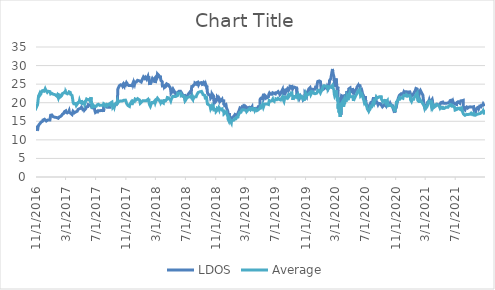
| Category | LDOS | Average |
|---|---|---|
| 11/1/16 | 12.394 | 19.025 |
| 11/2/16 | 12.337 | 19.194 |
| 11/3/16 | 13.289 | 19.428 |
| 11/4/16 | 13.101 | 19.058 |
| 11/7/16 | 13.227 | 19.512 |
| 11/8/16 | 13.026 | 19.651 |
| 11/9/16 | 13.478 | 20.742 |
| 11/10/16 | 13.724 | 20.989 |
| 11/11/16 | 13.906 | 21.803 |
| 11/14/16 | 14.191 | 22.252 |
| 11/15/16 | 14.346 | 21.87 |
| 11/16/16 | 14.331 | 21.999 |
| 11/17/16 | 14.236 | 22.033 |
| 11/18/16 | 14.478 | 22.127 |
| 11/21/16 | 14.804 | 22.443 |
| 11/22/16 | 14.81 | 22.986 |
| 11/23/16 | 14.879 | 23.064 |
| 11/25/16 | 14.963 | 23.169 |
| 11/28/16 | 15.044 | 23.191 |
| 11/29/16 | 15.346 | 23.568 |
| 11/30/16 | 15.328 | 23.244 |
| 12/1/16 | 15.328 | 22.798 |
| 12/2/16 | 15.439 | 23.075 |
| 12/5/16 | 15.532 | 23.196 |
| 12/6/16 | 15.682 | 23.416 |
| 12/7/16 | 15.604 | 23.279 |
| 12/8/16 | 15.648 | 23.744 |
| 12/9/16 | 15.643 | 23.974 |
| 12/12/16 | 15.059 | 23.177 |
| 12/13/16 | 15.274 | 23.156 |
| 12/14/16 | 15.268 | 22.96 |
| 12/15/16 | 15.319 | 22.945 |
| 12/16/16 | 15.319 | 22.806 |
| 12/19/16 | 15.37 | 23.082 |
| 12/20/16 | 15.406 | 23.137 |
| 12/21/16 | 15.376 | 22.961 |
| 12/22/16 | 15.292 | 22.867 |
| 12/23/16 | 15.286 | 22.914 |
| 12/27/16 | 15.343 | 22.979 |
| 12/28/16 | 15.238 | 22.743 |
| 12/29/16 | 15.385 | 22.983 |
| 12/30/16 | 16.633 | 22.368 |
| 1/3/17 | 16.571 | 22.227 |
| 1/4/17 | 16.701 | 22.517 |
| 1/5/17 | 16.513 | 22.375 |
| 1/6/17 | 16.477 | 22.489 |
| 1/9/17 | 16.256 | 22.311 |
| 1/10/17 | 16.35 | 22.446 |
| 1/11/17 | 16.295 | 22.407 |
| 1/12/17 | 16.259 | 22.425 |
| 1/13/17 | 16.249 | 22.386 |
| 1/17/17 | 16.074 | 22.144 |
| 1/18/17 | 16.204 | 22.199 |
| 1/19/17 | 16.161 | 22.048 |
| 1/20/17 | 16.152 | 22.063 |
| 1/23/17 | 16.028 | 21.829 |
| 1/24/17 | 16.09 | 22.021 |
| 1/25/17 | 16.148 | 22.009 |
| 1/26/17 | 16.113 | 22.122 |
| 1/27/17 | 16.116 | 22.182 |
| 1/30/17 | 15.813 | 21.356 |
| 1/31/17 | 15.716 | 21.492 |
| 2/1/17 | 15.712 | 21.424 |
| 2/2/17 | 15.966 | 22.143 |
| 2/3/17 | 16.161 | 22.001 |
| 2/6/17 | 16.301 | 21.948 |
| 2/7/17 | 16.415 | 21.983 |
| 2/8/17 | 16.292 | 21.62 |
| 2/9/17 | 16.529 | 21.79 |
| 2/10/17 | 16.535 | 21.793 |
| 2/13/17 | 16.584 | 21.916 |
| 2/14/17 | 16.607 | 21.845 |
| 2/15/17 | 16.789 | 22.162 |
| 2/16/17 | 16.916 | 22.459 |
| 2/17/17 | 16.896 | 22.347 |
| 2/21/17 | 17.127 | 22.613 |
| 2/22/17 | 17.28 | 22.72 |
| 2/23/17 | 17.072 | 22.459 |
| 2/24/17 | 17.589 | 22.764 |
| 2/27/17 | 17.576 | 22.977 |
| 2/28/17 | 17.336 | 22.429 |
| 3/1/17 | 17.788 | 22.891 |
| 3/2/17 | 17.414 | 22.718 |
| 3/3/17 | 17.462 | 22.589 |
| 3/6/17 | 17.293 | 22.406 |
| 3/7/17 | 17.244 | 22.43 |
| 3/8/17 | 17.144 | 22.387 |
| 3/9/17 | 17.215 | 22.307 |
| 3/10/17 | 17.176 | 22.403 |
| 3/13/17 | 17.547 | 22.637 |
| 3/14/17 | 17.459 | 22.62 |
| 3/15/17 | 17.846 | 22.913 |
| 3/16/17 | 17.479 | 22.662 |
| 3/17/17 | 17.547 | 22.954 |
| 3/20/17 | 17.524 | 22.752 |
| 3/21/17 | 17.17 | 22.27 |
| 3/22/17 | 17.196 | 22.395 |
| 3/23/17 | 17.134 | 22.461 |
| 3/24/17 | 17.114 | 22.234 |
| 3/27/17 | 16.822 | 21.949 |
| 3/28/17 | 16.815 | 21.973 |
| 3/29/17 | 16.988 | 22.061 |
| 3/30/17 | 16.692 | 20.786 |
| 3/31/17 | 17.672 | 20.131 |
| 4/3/17 | 17.468 | 19.737 |
| 4/4/17 | 17.523 | 19.796 |
| 4/5/17 | 17.261 | 19.589 |
| 4/6/17 | 17.295 | 19.661 |
| 4/7/17 | 17.496 | 19.778 |
| 4/10/17 | 17.492 | 19.795 |
| 4/11/17 | 17.624 | 19.925 |
| 4/12/17 | 17.537 | 19.566 |
| 4/13/17 | 17.499 | 19.253 |
| 4/17/17 | 17.72 | 19.622 |
| 4/18/17 | 17.748 | 19.648 |
| 4/19/17 | 17.879 | 19.784 |
| 4/20/17 | 18.176 | 20.033 |
| 4/21/17 | 18.042 | 19.909 |
| 4/24/17 | 18.29 | 20.296 |
| 4/25/17 | 18.366 | 20.29 |
| 4/26/17 | 18.453 | 20.567 |
| 4/27/17 | 18.436 | 20.43 |
| 4/28/17 | 18.197 | 20.131 |
| 5/1/17 | 18.484 | 20.193 |
| 5/2/17 | 18.508 | 20.095 |
| 5/3/17 | 18.522 | 19.929 |
| 5/4/17 | 18.795 | 20.723 |
| 5/5/17 | 18.823 | 20.136 |
| 5/8/17 | 18.422 | 20.029 |
| 5/9/17 | 18.159 | 19.832 |
| 5/10/17 | 18.118 | 19.934 |
| 5/11/17 | 18.211 | 19.794 |
| 5/12/17 | 18.201 | 19.866 |
| 5/15/17 | 18.246 | 20.14 |
| 5/16/17 | 18.56 | 20.17 |
| 5/17/17 | 18.062 | 19.609 |
| 5/18/17 | 17.807 | 19.572 |
| 5/19/17 | 18.007 | 19.671 |
| 5/22/17 | 18.443 | 20.441 |
| 5/23/17 | 18.892 | 20.485 |
| 5/24/17 | 18.971 | 20.619 |
| 5/25/17 | 19.051 | 20.987 |
| 5/26/17 | 18.964 | 21.078 |
| 5/30/17 | 18.954 | 20.803 |
| 5/31/17 | 19.199 | 20.802 |
| 6/1/17 | 19.479 | 21.06 |
| 6/2/17 | 19.334 | 21.001 |
| 6/5/17 | 19.31 | 20.877 |
| 6/6/17 | 19.327 | 20.64 |
| 6/7/17 | 19.237 | 20.59 |
| 6/8/17 | 19.258 | 20.852 |
| 6/9/17 | 19.134 | 20.751 |
| 6/12/17 | 19.22 | 21.473 |
| 6/13/17 | 19.244 | 20.841 |
| 6/14/17 | 19.054 | 20.847 |
| 6/15/17 | 19.065 | 20.734 |
| 6/16/17 | 18.653 | 18.802 |
| 6/19/17 | 18.636 | 18.912 |
| 6/20/17 | 18.446 | 18.825 |
| 6/21/17 | 18.574 | 18.899 |
| 6/22/17 | 18.526 | 19.261 |
| 6/23/17 | 18.508 | 19.005 |
| 6/26/17 | 18.56 | 18.95 |
| 6/27/17 | 18.021 | 18.761 |
| 6/28/17 | 18.066 | 19.147 |
| 6/29/17 | 17.783 | 18.872 |
| 6/30/17 | 17.366 | 18.913 |
| 7/3/17 | 17.474 | 19.037 |
| 7/5/17 | 17.591 | 19.159 |
| 7/6/17 | 17.198 | 18.968 |
| 7/7/17 | 17.494 | 19.425 |
| 7/10/17 | 17.494 | 19.208 |
| 7/11/17 | 17.544 | 19.392 |
| 7/12/17 | 17.836 | 19.578 |
| 7/13/17 | 17.675 | 19.49 |
| 7/14/17 | 17.887 | 19.551 |
| 7/17/17 | 17.833 | 19.286 |
| 7/18/17 | 17.668 | 19.137 |
| 7/19/17 | 17.937 | 19.442 |
| 7/20/17 | 18.015 | 19.391 |
| 7/21/17 | 17.954 | 19.291 |
| 7/24/17 | 17.924 | 19.304 |
| 7/25/17 | 18.105 | 19.488 |
| 7/26/17 | 17.968 | 19.49 |
| 7/27/17 | 17.941 | 19.434 |
| 7/28/17 | 18.008 | 19.507 |
| 7/31/17 | 17.954 | 19.343 |
| 8/1/17 | 17.914 | 19.653 |
| 8/2/17 | 17.561 | 19.337 |
| 8/3/17 | 19.029 | 19.717 |
| 8/4/17 | 18.878 | 19.783 |
| 8/7/17 | 18.932 | 19.584 |
| 8/8/17 | 19.036 | 19.506 |
| 8/9/17 | 18.875 | 19.188 |
| 8/10/17 | 18.972 | 19.204 |
| 8/11/17 | 19.043 | 19.305 |
| 8/14/17 | 19.274 | 19.488 |
| 8/15/17 | 19.251 | 19.462 |
| 8/16/17 | 19.221 | 19.683 |
| 8/17/17 | 18.794 | 19.216 |
| 8/18/17 | 18.592 | 19.09 |
| 8/21/17 | 18.582 | 19.229 |
| 8/22/17 | 18.784 | 19.59 |
| 8/23/17 | 18.888 | 19.509 |
| 8/24/17 | 18.663 | 19.48 |
| 8/25/17 | 18.767 | 19.451 |
| 8/28/17 | 18.781 | 19.392 |
| 8/29/17 | 19.022 | 19.541 |
| 8/30/17 | 19.264 | 19.637 |
| 8/31/17 | 19.594 | 19.957 |
| 9/1/17 | 19.735 | 20.206 |
| 9/5/17 | 19.419 | 20.163 |
| 9/6/17 | 19.473 | 20.233 |
| 9/7/17 | 19.385 | 20.126 |
| 9/8/17 | 19.187 | 18.761 |
| 9/11/17 | 19.288 | 18.955 |
| 9/12/17 | 19.379 | 19.152 |
| 9/13/17 | 19.197 | 19.059 |
| 9/14/17 | 18.925 | 18.83 |
| 9/15/17 | 18.948 | 19.193 |
| 9/18/17 | 19.261 | 19.394 |
| 9/19/17 | 19.493 | 19.739 |
| 9/20/17 | 19.543 | 19.906 |
| 9/21/17 | 19.577 | 19.904 |
| 9/22/17 | 19.765 | 19.969 |
| 9/25/17 | 19.681 | 20.012 |
| 9/26/17 | 19.731 | 20.17 |
| 9/27/17 | 19.966 | 20.473 |
| 9/28/17 | 19.792 | 20.374 |
| 9/29/17 | 23.644 | 19.975 |
| 10/2/17 | 24.119 | 20.266 |
| 10/3/17 | 23.924 | 20.306 |
| 10/4/17 | 24.055 | 20.328 |
| 10/5/17 | 24.566 | 20.473 |
| 10/6/17 | 24.654 | 20.407 |
| 10/9/17 | 24.754 | 20.474 |
| 10/10/17 | 24.814 | 20.567 |
| 10/11/17 | 24.81 | 20.43 |
| 10/12/17 | 24.882 | 20.51 |
| 10/13/17 | 25.057 | 20.591 |
| 10/16/17 | 24.786 | 20.445 |
| 10/17/17 | 24.682 | 20.216 |
| 10/18/17 | 24.514 | 20.323 |
| 10/19/17 | 24.562 | 20.434 |
| 10/20/17 | 24.826 | 20.638 |
| 10/23/17 | 24.666 | 20.65 |
| 10/24/17 | 24.45 | 20.729 |
| 10/25/17 | 25.049 | 20.834 |
| 10/26/17 | 24.942 | 20.851 |
| 10/27/17 | 24.898 | 20.896 |
| 10/30/17 | 24.73 | 20.695 |
| 10/31/17 | 24.962 | 20.869 |
| 11/1/17 | 25.085 | 20.742 |
| 11/2/17 | 25.081 | 20.209 |
| 11/3/17 | 25.417 | 19.93 |
| 11/6/17 | 25.133 | 19.53 |
| 11/7/17 | 24.986 | 19.653 |
| 11/8/17 | 24.842 | 19.552 |
| 11/9/17 | 24.614 | 19.286 |
| 11/10/17 | 24.702 | 19.2 |
| 11/13/17 | 24.606 | 19.107 |
| 11/14/17 | 24.506 | 19.085 |
| 11/15/17 | 24.67 | 19.011 |
| 11/16/17 | 24.69 | 19.419 |
| 11/17/17 | 24.391 | 19.332 |
| 11/20/17 | 24.61 | 19.548 |
| 11/21/17 | 24.534 | 20.009 |
| 11/22/17 | 24.395 | 19.726 |
| 11/24/17 | 24.478 | 19.708 |
| 11/27/17 | 24.578 | 19.722 |
| 11/28/17 | 25.069 | 20.014 |
| 11/29/17 | 24.91 | 20.152 |
| 11/30/17 | 25.381 | 20.454 |
| 12/1/17 | 24.882 | 20.277 |
| 12/4/17 | 25.337 | 20.313 |
| 12/5/17 | 25.289 | 20.317 |
| 12/6/17 | 24.998 | 20.166 |
| 12/7/17 | 25.225 | 20.447 |
| 12/8/17 | 25.604 | 20.971 |
| 12/11/17 | 25.668 | 20.824 |
| 12/12/17 | 25.608 | 20.761 |
| 12/13/17 | 25.576 | 20.765 |
| 12/14/17 | 25.5 | 20.532 |
| 12/15/17 | 25.792 | 20.816 |
| 12/18/17 | 26.028 | 21.106 |
| 12/19/17 | 25.848 | 21.025 |
| 12/20/17 | 25.964 | 20.975 |
| 12/21/17 | 25.992 | 20.867 |
| 12/22/17 | 26.04 | 20.851 |
| 12/26/17 | 25.868 | 20.733 |
| 12/27/17 | 25.808 | 20.719 |
| 12/28/17 | 25.88 | 20.704 |
| 12/29/17 | 25.808 | 19.874 |
| 1/2/18 | 25.58 | 20.021 |
| 1/3/18 | 25.548 | 20.197 |
| 1/4/18 | 25.9 | 20.189 |
| 1/5/18 | 25.872 | 20.273 |
| 1/8/18 | 26.531 | 20.545 |
| 1/9/18 | 26.476 | 20.455 |
| 1/10/18 | 26.611 | 20.438 |
| 1/11/18 | 26.955 | 20.695 |
| 1/12/18 | 26.791 | 20.466 |
| 1/16/18 | 26.555 | 20.514 |
| 1/17/18 | 26.747 | 20.656 |
| 1/18/18 | 26.511 | 20.403 |
| 1/19/18 | 26.835 | 20.563 |
| 1/22/18 | 26.831 | 20.514 |
| 1/23/18 | 26.755 | 20.604 |
| 1/24/18 | 26.316 | 20.403 |
| 1/25/18 | 26.348 | 20.538 |
| 1/26/18 | 26.495 | 20.772 |
| 1/29/18 | 27.059 | 20.878 |
| 1/30/18 | 26.651 | 20.526 |
| 1/31/18 | 26.619 | 20.452 |
| 2/1/18 | 27.159 | 21.052 |
| 2/2/18 | 26.472 | 20.219 |
| 2/5/18 | 25.232 | 19.424 |
| 2/6/18 | 24.769 | 19.17 |
| 2/7/18 | 25.7 | 19.499 |
| 2/8/18 | 25.005 | 19.022 |
| 2/9/18 | 25.029 | 19.178 |
| 2/12/18 | 25.716 | 19.771 |
| 2/13/18 | 25.828 | 19.722 |
| 2/14/18 | 26.272 | 20.051 |
| 2/15/18 | 26.412 | 20.133 |
| 2/16/18 | 26.547 | 20.052 |
| 2/20/18 | 26.472 | 20.003 |
| 2/21/18 | 26.064 | 20.041 |
| 2/22/18 | 26.28 | 20.15 |
| 2/23/18 | 26.312 | 20.264 |
| 2/26/18 | 26.539 | 20.493 |
| 2/27/18 | 26.068 | 20.398 |
| 2/28/18 | 25.304 | 19.997 |
| 3/1/18 | 25.484 | 20.038 |
| 3/2/18 | 25.98 | 20.391 |
| 3/5/18 | 26.352 | 20.687 |
| 3/6/18 | 26.46 | 20.757 |
| 3/7/18 | 26.635 | 20.733 |
| 3/8/18 | 27.143 | 20.79 |
| 3/9/18 | 27.746 | 21.211 |
| 3/12/18 | 27.714 | 20.977 |
| 3/13/18 | 27.698 | 20.878 |
| 3/14/18 | 27.391 | 20.887 |
| 3/15/18 | 27.187 | 20.88 |
| 3/16/18 | 27.063 | 21.121 |
| 3/19/18 | 26.839 | 20.368 |
| 3/20/18 | 27.011 | 20.767 |
| 3/21/18 | 26.999 | 20.744 |
| 3/22/18 | 26.372 | 20.314 |
| 3/23/18 | 25.988 | 19.969 |
| 3/26/18 | 26.232 | 20.248 |
| 3/27/18 | 25.78 | 20.147 |
| 3/28/18 | 25.684 | 20.092 |
| 3/29/18 | 24.48 | 20.049 |
| 4/2/18 | 24.285 | 19.918 |
| 4/3/18 | 24.461 | 20.407 |
| 4/4/18 | 24.618 | 20.588 |
| 4/5/18 | 24.884 | 20.907 |
| 4/6/18 | 24.278 | 20.353 |
| 4/9/18 | 24.248 | 20.308 |
| 4/10/18 | 24.641 | 20.53 |
| 4/11/18 | 24.352 | 20.488 |
| 4/12/18 | 24.588 | 20.66 |
| 4/13/18 | 24.416 | 20.641 |
| 4/16/18 | 24.674 | 20.926 |
| 4/17/18 | 25.015 | 21.152 |
| 4/18/18 | 25.15 | 21.403 |
| 4/19/18 | 24.996 | 21.339 |
| 4/20/18 | 24.753 | 21.269 |
| 4/23/18 | 24.794 | 21.306 |
| 4/24/18 | 24.558 | 21.153 |
| 4/25/18 | 24.524 | 21.031 |
| 4/26/18 | 24.558 | 21.11 |
| 4/27/18 | 24.622 | 20.995 |
| 4/30/18 | 24.042 | 20.808 |
| 5/1/18 | 23.761 | 20.74 |
| 5/2/18 | 23.222 | 20.501 |
| 5/3/18 | 22.559 | 20.756 |
| 5/4/18 | 22.507 | 20.95 |
| 5/7/18 | 22.769 | 21.158 |
| 5/8/18 | 23.031 | 21.414 |
| 5/9/18 | 23.405 | 21.583 |
| 5/10/18 | 23.611 | 21.715 |
| 5/11/18 | 23.682 | 21.806 |
| 5/14/18 | 23.319 | 21.668 |
| 5/15/18 | 23.031 | 21.708 |
| 5/16/18 | 23.012 | 21.911 |
| 5/17/18 | 22.743 | 21.577 |
| 5/18/18 | 22.949 | 21.647 |
| 5/21/18 | 22.982 | 21.654 |
| 5/22/18 | 22.387 | 21.418 |
| 5/23/18 | 22.683 | 21.457 |
| 5/24/18 | 22.586 | 21.551 |
| 5/25/18 | 22.556 | 21.49 |
| 5/29/18 | 22.38 | 21.919 |
| 5/30/18 | 22.679 | 22.502 |
| 5/31/18 | 22.481 | 22.539 |
| 6/1/18 | 22.773 | 22.412 |
| 6/4/18 | 23.054 | 22.532 |
| 6/5/18 | 23.173 | 22.576 |
| 6/6/18 | 23.184 | 22.589 |
| 6/7/18 | 22.848 | 22.414 |
| 6/8/18 | 22.941 | 22.547 |
| 6/11/18 | 23.054 | 22.577 |
| 6/12/18 | 23.162 | 22.549 |
| 6/13/18 | 23.117 | 21.862 |
| 6/14/18 | 22.739 | 21.951 |
| 6/15/18 | 22.526 | 21.855 |
| 6/18/18 | 22.271 | 21.986 |
| 6/19/18 | 22.271 | 22.039 |
| 6/20/18 | 21.841 | 21.888 |
| 6/21/18 | 21.68 | 22.223 |
| 6/22/18 | 21.897 | 22.118 |
| 6/25/18 | 22.028 | 21.803 |
| 6/26/18 | 22.327 | 21.881 |
| 6/27/18 | 21.916 | 21.791 |
| 6/28/18 | 21.953 | 21.768 |
| 6/29/18 | 21.055 | 20.484 |
| 7/2/18 | 21.191 | 20.755 |
| 7/3/18 | 21.134 | 20.979 |
| 7/5/18 | 21.277 | 21.008 |
| 7/6/18 | 21.476 | 21.372 |
| 7/9/18 | 21.89 | 21.475 |
| 7/10/18 | 21.865 | 21.385 |
| 7/11/18 | 21.926 | 21.459 |
| 7/12/18 | 22.29 | 21.669 |
| 7/13/18 | 22.279 | 21.684 |
| 7/16/18 | 22.301 | 21.603 |
| 7/17/18 | 22.69 | 21.768 |
| 7/18/18 | 22.665 | 21.735 |
| 7/19/18 | 22.858 | 21.787 |
| 7/20/18 | 22.961 | 21.821 |
| 7/23/18 | 23.029 | 21.701 |
| 7/24/18 | 22.561 | 21.428 |
| 7/25/18 | 22.75 | 21.509 |
| 7/26/18 | 24.342 | 21.623 |
| 7/27/18 | 24.435 | 21.38 |
| 7/30/18 | 24.114 | 20.877 |
| 7/31/18 | 24.417 | 21.587 |
| 8/1/18 | 24.488 | 21.522 |
| 8/2/18 | 24.695 | 21.728 |
| 8/3/18 | 24.835 | 21.217 |
| 8/6/18 | 24.867 | 21.565 |
| 8/7/18 | 24.902 | 21.533 |
| 8/8/18 | 25.313 | 21.776 |
| 8/9/18 | 25.209 | 21.761 |
| 8/10/18 | 25.177 | 21.623 |
| 8/13/18 | 25.081 | 21.585 |
| 8/14/18 | 25.359 | 21.8 |
| 8/15/18 | 25.202 | 21.687 |
| 8/16/18 | 25.266 | 22.151 |
| 8/17/18 | 25.595 | 22.233 |
| 8/20/18 | 25.523 | 22.292 |
| 8/21/18 | 25.691 | 22.732 |
| 8/22/18 | 25.463 | 22.749 |
| 8/23/18 | 24.813 | 22.469 |
| 8/24/18 | 25.052 | 22.704 |
| 8/27/18 | 25.298 | 22.928 |
| 8/28/18 | 25.124 | 22.868 |
| 8/29/18 | 25.384 | 23.084 |
| 8/30/18 | 25.341 | 22.911 |
| 8/31/18 | 25.256 | 22.862 |
| 9/4/18 | 25.42 | 23.042 |
| 9/5/18 | 25.241 | 23.167 |
| 9/6/18 | 25.32 | 23.113 |
| 9/7/18 | 24.92 | 23.023 |
| 9/10/18 | 24.981 | 22.193 |
| 9/11/18 | 25.056 | 22.124 |
| 9/12/18 | 25.056 | 21.993 |
| 9/13/18 | 25.295 | 22.046 |
| 9/14/18 | 25.398 | 22.227 |
| 9/17/18 | 25.188 | 21.962 |
| 9/18/18 | 25.066 | 21.883 |
| 9/19/18 | 24.424 | 21.326 |
| 9/20/18 | 24.535 | 21.225 |
| 9/21/18 | 24.895 | 21.406 |
| 9/24/18 | 24.267 | 21.441 |
| 9/25/18 | 24.567 | 21.477 |
| 9/26/18 | 24.246 | 21.385 |
| 9/27/18 | 24.421 | 21.359 |
| 9/28/18 | 22.677 | 19.665 |
| 10/1/18 | 22.251 | 19.455 |
| 10/2/18 | 22.471 | 19.462 |
| 10/3/18 | 22.205 | 19.442 |
| 10/4/18 | 22.198 | 19.284 |
| 10/5/18 | 22.136 | 19.334 |
| 10/8/18 | 22.031 | 19.242 |
| 10/9/18 | 22.035 | 19.276 |
| 10/10/18 | 21.651 | 18.705 |
| 10/11/18 | 21.231 | 18.387 |
| 10/12/18 | 21.339 | 18.387 |
| 10/15/18 | 21.605 | 18.622 |
| 10/16/18 | 22.176 | 19.098 |
| 10/17/18 | 22.198 | 18.956 |
| 10/18/18 | 21.874 | 18.653 |
| 10/19/18 | 22.156 | 18.704 |
| 10/22/18 | 22.015 | 18.94 |
| 10/23/18 | 21.792 | 18.849 |
| 10/24/18 | 20.53 | 18.039 |
| 10/25/18 | 20.074 | 18.156 |
| 10/26/18 | 20.077 | 17.929 |
| 10/29/18 | 20.274 | 18.04 |
| 10/30/18 | 20.697 | 18.067 |
| 10/31/18 | 21.241 | 18.568 |
| 11/1/18 | 20.776 | 18.222 |
| 11/2/18 | 20.461 | 17.644 |
| 11/5/18 | 20.516 | 17.682 |
| 11/6/18 | 20.825 | 17.968 |
| 11/7/18 | 21.526 | 18.568 |
| 11/8/18 | 21.585 | 18.553 |
| 11/9/18 | 21.389 | 18.621 |
| 11/12/18 | 21.11 | 18.433 |
| 11/13/18 | 21.136 | 18.529 |
| 11/14/18 | 20.752 | 18.15 |
| 11/15/18 | 21.1 | 18.609 |
| 11/16/18 | 21.212 | 18.678 |
| 11/19/18 | 20.956 | 18.248 |
| 11/20/18 | 20.474 | 18.01 |
| 11/21/18 | 20.67 | 18.182 |
| 11/23/18 | 20.625 | 18.159 |
| 11/26/18 | 20.92 | 18.359 |
| 11/27/18 | 20.576 | 17.973 |
| 11/28/18 | 20.73 | 18.127 |
| 11/29/18 | 20.356 | 17.947 |
| 11/30/18 | 20.657 | 17.88 |
| 12/3/18 | 20.52 | 17.827 |
| 12/4/18 | 19.329 | 17.014 |
| 12/6/18 | 19.759 | 17.099 |
| 12/7/18 | 19.303 | 17.226 |
| 12/10/18 | 19.503 | 17.391 |
| 12/11/18 | 19.208 | 17.38 |
| 12/12/18 | 19.503 | 17.868 |
| 12/13/18 | 19.162 | 17.633 |
| 12/14/18 | 18.706 | 17.3 |
| 12/17/18 | 18.202 | 16.834 |
| 12/18/18 | 18.182 | 16.77 |
| 12/19/18 | 17.867 | 16.472 |
| 12/20/18 | 17.585 | 16.171 |
| 12/21/18 | 16.857 | 15.514 |
| 12/24/18 | 16.572 | 15.098 |
| 12/26/18 | 17.178 | 15.725 |
| 12/27/18 | 17.234 | 15.684 |
| 12/28/18 | 15.504 | 15.78 |
| 12/31/18 | 15.598 | 14.993 |
| 1/2/19 | 15.4 | 14.806 |
| 1/3/19 | 15.187 | 14.591 |
| 1/4/19 | 15.794 | 15.119 |
| 1/7/19 | 15.829 | 15.065 |
| 1/8/19 | 15.95 | 15.33 |
| 1/9/19 | 16.146 | 15.268 |
| 1/10/19 | 16.246 | 15.285 |
| 1/11/19 | 16.397 | 15.476 |
| 1/14/19 | 16.37 | 15.314 |
| 1/15/19 | 16.388 | 15.331 |
| 1/16/19 | 16.356 | 15.442 |
| 1/17/19 | 16.592 | 15.754 |
| 1/18/19 | 16.829 | 15.83 |
| 1/22/19 | 16.604 | 15.707 |
| 1/23/19 | 16.613 | 15.674 |
| 1/24/19 | 16.678 | 15.72 |
| 1/25/19 | 16.879 | 16.109 |
| 1/28/19 | 16.891 | 15.937 |
| 1/29/19 | 17.016 | 16.07 |
| 1/30/19 | 17.217 | 16.156 |
| 1/31/19 | 17.16 | 16.497 |
| 2/1/19 | 17.498 | 16.759 |
| 2/4/19 | 17.965 | 17.111 |
| 2/5/19 | 18.131 | 17.288 |
| 2/6/19 | 18.184 | 17.388 |
| 2/7/19 | 18.557 | 17.537 |
| 2/8/19 | 18.368 | 17.619 |
| 2/11/19 | 18.326 | 17.44 |
| 2/12/19 | 18.35 | 17.588 |
| 2/13/19 | 18.409 | 17.716 |
| 2/14/19 | 18.442 | 17.779 |
| 2/15/19 | 18.749 | 18.051 |
| 2/19/19 | 18.436 | 18.109 |
| 2/20/19 | 18.249 | 18.123 |
| 2/21/19 | 18.625 | 18.033 |
| 2/22/19 | 19.081 | 18.213 |
| 2/25/19 | 19.131 | 18.063 |
| 2/26/19 | 18.802 | 17.805 |
| 2/27/19 | 18.912 | 17.844 |
| 2/28/19 | 19.11 | 17.866 |
| 3/1/19 | 19.226 | 18.084 |
| 3/4/19 | 18.965 | 17.91 |
| 3/5/19 | 18.811 | 17.79 |
| 3/6/19 | 18.649 | 17.592 |
| 3/7/19 | 18.471 | 17.551 |
| 3/8/19 | 18.474 | 17.625 |
| 3/11/19 | 18.693 | 17.999 |
| 3/12/19 | 18.649 | 18.014 |
| 3/13/19 | 18.743 | 18.211 |
| 3/14/19 | 18.563 | 18.266 |
| 3/15/19 | 18.59 | 18.256 |
| 3/18/19 | 18.785 | 18.394 |
| 3/19/19 | 18.729 | 18.338 |
| 3/20/19 | 18.717 | 18.166 |
| 3/21/19 | 18.862 | 18.431 |
| 3/22/19 | 18.637 | 18.082 |
| 3/25/19 | 18.53 | 18.076 |
| 3/26/19 | 18.749 | 18.445 |
| 3/27/19 | 18.72 | 18.321 |
| 3/28/19 | 18.856 | 18.44 |
| 3/29/19 | 18.25 | 18.22 |
| 4/1/19 | 18.478 | 18.435 |
| 4/2/19 | 18.122 | 18.124 |
| 4/3/19 | 18.134 | 18.083 |
| 4/4/19 | 18.219 | 18.08 |
| 4/5/19 | 18.396 | 18.274 |
| 4/8/19 | 18.452 | 18.214 |
| 4/9/19 | 18.225 | 17.919 |
| 4/10/19 | 18.401 | 18.044 |
| 4/11/19 | 18.581 | 18.164 |
| 4/12/19 | 18.606 | 18.233 |
| 4/15/19 | 18.498 | 18.215 |
| 4/16/19 | 18.546 | 18.073 |
| 4/17/19 | 18.538 | 17.871 |
| 4/18/19 | 18.581 | 17.921 |
| 4/22/19 | 18.623 | 18.068 |
| 4/23/19 | 18.939 | 18.32 |
| 4/24/19 | 18.945 | 18.306 |
| 4/25/19 | 18.905 | 18.232 |
| 4/26/19 | 18.951 | 18.341 |
| 4/29/19 | 19.042 | 18.284 |
| 4/30/19 | 20.924 | 18.613 |
| 5/1/19 | 20.745 | 18.264 |
| 5/2/19 | 20.827 | 18.744 |
| 5/3/19 | 21.2 | 19.117 |
| 5/6/19 | 21.104 | 19.293 |
| 5/7/19 | 20.938 | 18.928 |
| 5/8/19 | 21.121 | 18.957 |
| 5/9/19 | 21.363 | 19.161 |
| 5/10/19 | 21.494 | 19.381 |
| 5/13/19 | 21.007 | 18.753 |
| 5/14/19 | 21.158 | 18.864 |
| 5/15/19 | 21.371 | 19.109 |
| 5/16/19 | 21.724 | 19.546 |
| 5/17/19 | 21.639 | 19.483 |
| 5/20/19 | 21.434 | 19.477 |
| 5/21/19 | 21.85 | 19.661 |
| 5/22/19 | 21.918 | 19.764 |
| 5/23/19 | 21.679 | 19.534 |
| 5/24/19 | 21.719 | 19.708 |
| 5/28/19 | 21.351 | 19.678 |
| 5/29/19 | 21.3 | 19.613 |
| 5/30/19 | 21.309 | 19.572 |
| 5/31/19 | 21.451 | 19.607 |
| 6/3/19 | 21.619 | 19.527 |
| 6/4/19 | 22.211 | 19.856 |
| 6/5/19 | 22.246 | 20.044 |
| 6/6/19 | 22.411 | 20.6 |
| 6/7/19 | 22.616 | 20.781 |
| 6/10/19 | 22.544 | 20.75 |
| 6/11/19 | 22.305 | 20.4 |
| 6/12/19 | 22.567 | 20.538 |
| 6/13/19 | 22.331 | 20.587 |
| 6/14/19 | 22.451 | 20.45 |
| 6/17/19 | 22.282 | 20.555 |
| 6/18/19 | 22.391 | 20.562 |
| 6/19/19 | 22.391 | 20.749 |
| 6/20/19 | 22.684 | 20.93 |
| 6/21/19 | 22.473 | 20.633 |
| 6/24/19 | 22.485 | 20.578 |
| 6/25/19 | 22.533 | 20.618 |
| 6/26/19 | 22.357 | 20.386 |
| 6/27/19 | 22.607 | 20.662 |
| 6/28/19 | 22.271 | 20.553 |
| 7/1/19 | 22.36 | 20.711 |
| 7/2/19 | 22.352 | 20.765 |
| 7/3/19 | 22.703 | 21.049 |
| 7/5/19 | 22.876 | 21.181 |
| 7/8/19 | 22.706 | 20.884 |
| 7/9/19 | 22.737 | 21.055 |
| 7/10/19 | 22.731 | 21.089 |
| 7/11/19 | 22.854 | 20.932 |
| 7/12/19 | 22.99 | 21.193 |
| 7/15/19 | 22.965 | 21.169 |
| 7/16/19 | 22.882 | 21.123 |
| 7/17/19 | 22.527 | 20.874 |
| 7/18/19 | 22.58 | 20.902 |
| 7/19/19 | 22.198 | 20.703 |
| 7/22/19 | 22.196 | 20.738 |
| 7/23/19 | 22.544 | 20.85 |
| 7/24/19 | 22.759 | 21.009 |
| 7/25/19 | 22.633 | 20.966 |
| 7/26/19 | 22.99 | 21.252 |
| 7/29/19 | 23.239 | 21.524 |
| 7/30/19 | 23.534 | 21.279 |
| 7/31/19 | 22.898 | 21.096 |
| 8/1/19 | 23.264 | 21.121 |
| 8/2/19 | 22.831 | 20.903 |
| 8/5/19 | 22.028 | 20.357 |
| 8/6/19 | 22.324 | 20.665 |
| 8/7/19 | 22.472 | 20.901 |
| 8/8/19 | 23.4 | 21.508 |
| 8/9/19 | 23.166 | 21.37 |
| 8/12/19 | 23.163 | 21.349 |
| 8/13/19 | 23.504 | 21.405 |
| 8/14/19 | 23.099 | 20.913 |
| 8/15/19 | 23.124 | 20.859 |
| 8/16/19 | 23.378 | 21.357 |
| 8/19/19 | 23.73 | 21.534 |
| 8/20/19 | 23.559 | 21.534 |
| 8/21/19 | 23.858 | 21.942 |
| 8/22/19 | 23.863 | 21.933 |
| 8/23/19 | 23.264 | 21.494 |
| 8/26/19 | 23.512 | 21.703 |
| 8/27/19 | 23.716 | 21.688 |
| 8/28/19 | 23.908 | 21.941 |
| 8/29/19 | 24.321 | 22.275 |
| 8/30/19 | 24.365 | 22.442 |
| 9/3/19 | 24.084 | 22.412 |
| 9/4/19 | 24.438 | 22.674 |
| 9/5/19 | 24.773 | 22.962 |
| 9/6/19 | 24.438 | 22.349 |
| 9/9/19 | 23.685 | 21.74 |
| 9/10/19 | 23.426 | 20.759 |
| 9/11/19 | 23.774 | 21.06 |
| 9/12/19 | 24.084 | 21.314 |
| 9/13/19 | 23.936 | 21.251 |
| 9/16/19 | 24.07 | 21.315 |
| 9/17/19 | 24.181 | 21.666 |
| 9/18/19 | 24.432 | 21.868 |
| 9/19/19 | 24.368 | 21.835 |
| 9/20/19 | 24.078 | 21.71 |
| 9/23/19 | 23.9 | 21.612 |
| 9/24/19 | 23.989 | 21.65 |
| 9/25/19 | 24.276 | 22.041 |
| 9/26/19 | 24.301 | 22.332 |
| 9/27/19 | 22.311 | 21.864 |
| 9/30/19 | 22.536 | 22.136 |
| 10/1/19 | 22.248 | 21.704 |
| 10/2/19 | 21.77 | 21.412 |
| 10/3/19 | 21.781 | 21.529 |
| 10/4/19 | 21.946 | 21.813 |
| 10/7/19 | 21.99 | 21.768 |
| 10/8/19 | 21.476 | 21.473 |
| 10/9/19 | 21.702 | 21.702 |
| 10/10/19 | 21.794 | 21.852 |
| 10/11/19 | 21.823 | 21.932 |
| 10/14/19 | 21.639 | 21.671 |
| 10/15/19 | 21.578 | 21.797 |
| 10/16/19 | 21.345 | 21.678 |
| 10/17/19 | 21.442 | 21.633 |
| 10/18/19 | 21.418 | 21.374 |
| 10/21/19 | 21.214 | 21.399 |
| 10/22/19 | 20.807 | 20.777 |
| 10/23/19 | 20.794 | 20.6 |
| 10/24/19 | 21.004 | 20.768 |
| 10/25/19 | 20.988 | 20.779 |
| 10/28/19 | 21.206 | 20.88 |
| 10/29/19 | 22.67 | 21.356 |
| 10/30/19 | 22.749 | 21.549 |
| 10/31/19 | 22.628 | 21.463 |
| 11/1/19 | 22.392 | 22.426 |
| 11/4/19 | 22.51 | 22.206 |
| 11/5/19 | 21.828 | 21.807 |
| 11/6/19 | 22.34 | 22.045 |
| 11/7/19 | 22.568 | 22.113 |
| 11/8/19 | 22.883 | 22.106 |
| 11/11/19 | 23.006 | 22.244 |
| 11/12/19 | 23.358 | 22.266 |
| 11/13/19 | 23.484 | 22.166 |
| 11/14/19 | 23.733 | 22.442 |
| 11/15/19 | 23.888 | 22.539 |
| 11/18/19 | 23.982 | 22.732 |
| 11/19/19 | 24.066 | 22.732 |
| 11/20/19 | 24.053 | 22.816 |
| 11/21/19 | 23.631 | 22.6 |
| 11/22/19 | 23.224 | 22.249 |
| 11/25/19 | 23.625 | 22.67 |
| 11/26/19 | 23.804 | 22.99 |
| 11/27/19 | 23.875 | 23.083 |
| 11/29/19 | 23.838 | 22.901 |
| 12/2/19 | 23.578 | 22.844 |
| 12/3/19 | 23.528 | 22.549 |
| 12/4/19 | 23.549 | 22.674 |
| 12/5/19 | 23.604 | 22.633 |
| 12/6/19 | 23.796 | 22.711 |
| 12/9/19 | 23.644 | 22.429 |
| 12/10/19 | 23.523 | 22.384 |
| 12/11/19 | 24.163 | 22.384 |
| 12/12/19 | 23.93 | 22.392 |
| 12/13/19 | 24.1 | 22.605 |
| 12/16/19 | 24.048 | 22.578 |
| 12/17/19 | 24.019 | 22.576 |
| 12/18/19 | 25.108 | 22.684 |
| 12/19/19 | 25.266 | 22.993 |
| 12/20/19 | 25.719 | 23.353 |
| 12/23/19 | 25.67 | 23.468 |
| 12/24/19 | 25.725 | 23.324 |
| 12/26/19 | 25.856 | 23.367 |
| 12/27/19 | 25.777 | 23.304 |
| 12/30/19 | 25.735 | 23.282 |
| 12/31/19 | 25.688 | 22.661 |
| 1/2/20 | 25.88 | 22.859 |
| 1/3/20 | 23.488 | 23.112 |
| 1/6/20 | 23.696 | 23.33 |
| 1/7/20 | 23.609 | 23.248 |
| 1/8/20 | 23.58 | 23.464 |
| 1/9/20 | 23.866 | 24.079 |
| 1/10/20 | 23.852 | 24.163 |
| 1/13/20 | 23.883 | 24.543 |
| 1/14/20 | 23.798 | 24.471 |
| 1/15/20 | 24.116 | 24.792 |
| 1/16/20 | 24.152 | 24.622 |
| 1/17/20 | 24.412 | 24.665 |
| 1/21/20 | 24.383 | 24.491 |
| 1/22/20 | 24.194 | 24.385 |
| 1/23/20 | 24.232 | 24.51 |
| 1/24/20 | 23.994 | 24.239 |
| 1/27/20 | 23.793 | 24.13 |
| 1/28/20 | 24.156 | 24.384 |
| 1/29/20 | 24.043 | 24.245 |
| 1/30/20 | 24.22 | 24.72 |
| 1/31/20 | 23.722 | 23.701 |
| 2/3/20 | 24.192 | 24.048 |
| 2/4/20 | 24.865 | 24.254 |
| 2/5/20 | 25.176 | 24.211 |
| 2/6/20 | 25.963 | 24.575 |
| 2/7/20 | 25.998 | 24.158 |
| 2/10/20 | 26.114 | 24.274 |
| 2/11/20 | 26.478 | 24.328 |
| 2/12/20 | 26.208 | 24.129 |
| 2/13/20 | 26.704 | 24.332 |
| 2/14/20 | 26.636 | 24.312 |
| 2/18/20 | 29.094 | 24.675 |
| 2/19/20 | 28.411 | 24.748 |
| 2/20/20 | 28.161 | 24.262 |
| 2/21/20 | 27.677 | 23.878 |
| 2/24/20 | 26.876 | 23.348 |
| 2/25/20 | 25.772 | 22.397 |
| 2/26/20 | 26.166 | 22.527 |
| 2/27/20 | 24.818 | 21.821 |
| 2/28/20 | 24.237 | 21.671 |
| 3/2/20 | 25.986 | 22.357 |
| 3/3/20 | 25.814 | 22.395 |
| 3/4/20 | 26.522 | 23.317 |
| 3/5/20 | 25.398 | 22.584 |
| 3/6/20 | 24.952 | 22.208 |
| 3/9/20 | 23.028 | 20.472 |
| 3/10/20 | 24.27 | 21.479 |
| 3/11/20 | 23.132 | 20.453 |
| 3/12/20 | 20.258 | 18.272 |
| 3/13/20 | 21.323 | 19.852 |
| 3/16/20 | 18.417 | 17.35 |
| 3/17/20 | 19.215 | 17.968 |
| 3/18/20 | 18.36 | 17.084 |
| 3/19/20 | 17.923 | 17.023 |
| 3/20/20 | 17.12 | 16.18 |
| 3/23/20 | 16.724 | 15.968 |
| 3/24/20 | 18.525 | 17.881 |
| 3/25/20 | 20.334 | 18.713 |
| 3/26/20 | 21.854 | 19.821 |
| 3/27/20 | 22.062 | 19.792 |
| 3/30/20 | 22.06 | 20.283 |
| 3/31/20 | 21.64 | 19.351 |
| 4/1/20 | 20.577 | 18.96 |
| 4/2/20 | 20.926 | 19.336 |
| 4/3/20 | 20.452 | 18.94 |
| 4/6/20 | 22.069 | 20.17 |
| 4/7/20 | 21.536 | 19.672 |
| 4/8/20 | 22.197 | 20.134 |
| 4/9/20 | 22.202 | 20.797 |
| 4/13/20 | 21.415 | 20.216 |
| 4/14/20 | 22.227 | 21.333 |
| 4/15/20 | 21.562 | 20.736 |
| 4/16/20 | 21.594 | 21.014 |
| 4/17/20 | 23.09 | 21.806 |
| 4/20/20 | 22.932 | 21.404 |
| 4/21/20 | 21.992 | 20.686 |
| 4/22/20 | 22.702 | 21.201 |
| 4/23/20 | 22.992 | 21.5 |
| 4/24/20 | 23.711 | 21.901 |
| 4/27/20 | 23.909 | 22.488 |
| 4/28/20 | 23.797 | 22.216 |
| 4/29/20 | 23.946 | 22.287 |
| 4/30/20 | 22.981 | 21.575 |
| 5/1/20 | 22.767 | 21.356 |
| 5/4/20 | 23.004 | 21.53 |
| 5/5/20 | 22.895 | 21.622 |
| 5/6/20 | 22.602 | 21.592 |
| 5/7/20 | 23.346 | 21.71 |
| 5/8/20 | 23.885 | 21.685 |
| 5/11/20 | 23.739 | 21.651 |
| 5/12/20 | 23.236 | 21.011 |
| 5/13/20 | 22.213 | 20.506 |
| 5/14/20 | 22.288 | 20.599 |
| 5/15/20 | 22.518 | 20.933 |
| 5/18/20 | 22.962 | 21.218 |
| 5/19/20 | 22.75 | 21.13 |
| 5/20/20 | 23.004 | 21.529 |
| 5/21/20 | 23.118 | 21.676 |
| 5/22/20 | 23.481 | 21.872 |
| 5/26/20 | 23.781 | 22.285 |
| 5/27/20 | 23.899 | 22.537 |
| 5/28/20 | 24.271 | 22.728 |
| 5/29/20 | 24.488 | 22.792 |
| 6/1/20 | 24.648 | 22.953 |
| 6/2/20 | 24.311 | 23.238 |
| 6/3/20 | 24.946 | 23.326 |
| 6/4/20 | 24.646 | 23.33 |
| 6/5/20 | 24.664 | 22.928 |
| 6/8/20 | 24.778 | 23.234 |
| 6/9/20 | 24.581 | 23.027 |
| 6/10/20 | 24.367 | 23.236 |
| 6/11/20 | 23.343 | 21.857 |
| 6/12/20 | 23.004 | 21.935 |
| 6/15/20 | 22.936 | 21.798 |
| 6/16/20 | 23.325 | 22.267 |
| 6/17/20 | 23.302 | 22.377 |
| 6/18/20 | 23.102 | 22.147 |
| 6/19/20 | 22.49 | 21.793 |
| 6/22/20 | 22.534 | 21.768 |
| 6/23/20 | 22.367 | 21.545 |
| 6/24/20 | 21.688 | 20.67 |
| 6/25/20 | 21.564 | 20.631 |
| 6/26/20 | 20.88 | 20.155 |
| 6/29/20 | 21.443 | 20.589 |
| 6/30/20 | 21.785 | 19.664 |
| 7/1/20 | 21.701 | 19.844 |
| 7/2/20 | 20.424 | 19.89 |
| 7/6/20 | 19.292 | 19.203 |
| 7/7/20 | 19.17 | 18.703 |
| 7/8/20 | 19.207 | 18.626 |
| 7/9/20 | 18.847 | 18.246 |
| 7/10/20 | 19.174 | 18.444 |
| 7/13/20 | 18.548 | 17.824 |
| 7/14/20 | 18.801 | 17.969 |
| 7/15/20 | 19.154 | 18.309 |
| 7/16/20 | 18.884 | 17.917 |
| 7/17/20 | 19.231 | 18.136 |
| 7/20/20 | 19.333 | 18.35 |
| 7/21/20 | 19.436 | 18.423 |
| 7/22/20 | 19.929 | 19.077 |
| 7/23/20 | 19.776 | 18.875 |
| 7/24/20 | 19.863 | 18.883 |
| 7/27/20 | 19.665 | 18.947 |
| 7/28/20 | 19.669 | 18.822 |
| 7/29/20 | 20.06 | 19.156 |
| 7/30/20 | 20.145 | 19.365 |
| 7/31/20 | 20.756 | 19.967 |
| 8/3/20 | 21.44 | 20.348 |
| 8/4/20 | 20.125 | 20.14 |
| 8/5/20 | 19.571 | 20.013 |
| 8/6/20 | 19.85 | 20.128 |
| 8/7/20 | 20.33 | 20.597 |
| 8/10/20 | 20.594 | 20.65 |
| 8/11/20 | 20.928 | 20.937 |
| 8/12/20 | 20.592 | 20.852 |
| 8/13/20 | 20.588 | 21.208 |
| 8/14/20 | 20.66 | 21.491 |
| 8/17/20 | 20.119 | 21.216 |
| 8/18/20 | 20.025 | 21.22 |
| 8/19/20 | 20.197 | 21.366 |
| 8/20/20 | 19.852 | 21.327 |
| 8/21/20 | 19.449 | 21.29 |
| 8/24/20 | 19.807 | 21.539 |
| 8/25/20 | 19.765 | 21.319 |
| 8/26/20 | 19.748 | 21.314 |
| 8/27/20 | 19.996 | 21.64 |
| 8/28/20 | 19.916 | 21.648 |
| 8/31/20 | 19.737 | 21.573 |
| 9/1/20 | 19.565 | 21.633 |
| 9/2/20 | 19.988 | 21.906 |
| 9/3/20 | 19.414 | 21.301 |
| 9/4/20 | 19.301 | 20.961 |
| 9/8/20 | 18.878 | 20.494 |
| 9/9/20 | 19.013 | 20.772 |
| 9/10/20 | 18.736 | 20.39 |
| 9/11/20 | 19.013 | 20.349 |
| 9/14/20 | 19.268 | 20.456 |
| 9/15/20 | 19.355 | 20.563 |
| 9/16/20 | 19.434 | 20.606 |
| 9/17/20 | 19.68 | 20.491 |
| 9/18/20 | 19.643 | 20.286 |
| 9/21/20 | 19.288 | 20.301 |
| 9/22/20 | 19.979 | 20.878 |
| 9/23/20 | 19.63 | 20.092 |
| 9/24/20 | 19.2 | 19.981 |
| 9/25/20 | 20.062 | 20.345 |
| 9/28/20 | 19.972 | 20.546 |
| 9/29/20 | 19.754 | 20.301 |
| 9/30/20 | 19.445 | 19.151 |
| 10/1/20 | 19.722 | 19.244 |
| 10/2/20 | 19.775 | 19.258 |
| 10/5/20 | 19.651 | 19.259 |
| 10/6/20 | 19.474 | 19.201 |
| 10/7/20 | 19.358 | 19.089 |
| 10/8/20 | 19.513 | 19.084 |
| 10/9/20 | 19.88 | 19.11 |
| 10/12/20 | 19.627 | 19.386 |
| 10/13/20 | 19.294 | 19.341 |
| 10/14/20 | 19.36 | 19.366 |
| 10/15/20 | 19.204 | 19.205 |
| 10/16/20 | 19.215 | 19.347 |
| 10/19/20 | 18.894 | 18.871 |
| 10/20/20 | 18.843 | 18.816 |
| 10/21/20 | 18.5 | 18.614 |
| 10/22/20 | 18.773 | 18.6 |
| 10/23/20 | 18.771 | 18.712 |
| 10/26/20 | 18.255 | 18.284 |
| 10/27/20 | 18.093 | 18.09 |
| 10/28/20 | 17.358 | 17.614 |
| 10/29/20 | 17.776 | 17.9 |
| 10/30/20 | 18.159 | 18.464 |
| 11/2/20 | 18.756 | 19.102 |
| 11/3/20 | 19.244 | 19.611 |
| 11/4/20 | 20.198 | 20.494 |
| 11/5/20 | 19.996 | 20.385 |
| 11/6/20 | 19.793 | 20.167 |
| 11/9/20 | 20.703 | 20.573 |
| 11/10/20 | 20.771 | 20.703 |
| 11/11/20 | 20.782 | 20.605 |
| 11/12/20 | 20.6 | 20.54 |
| 11/13/20 | 21.543 | 20.975 |
| 11/16/20 | 22.016 | 21.37 |
| 11/17/20 | 21.939 | 21.379 |
| 11/18/20 | 21.775 | 21.127 |
| 11/19/20 | 21.952 | 21.089 |
| 11/20/20 | 21.959 | 21.047 |
| 11/23/20 | 22.398 | 21.378 |
| 11/24/20 | 22.44 | 21.541 |
| 11/25/20 | 22.455 | 21.556 |
| 11/27/20 | 22.377 | 21.562 |
| 11/30/20 | 22.031 | 21.196 |
| 12/1/20 | 22.237 | 21.547 |
| 12/2/20 | 22.556 | 21.574 |
| 12/3/20 | 22.51 | 21.639 |
| 12/4/20 | 22.93 | 21.988 |
| 12/7/20 | 22.644 | 21.906 |
| 12/8/20 | 22.742 | 21.945 |
| 12/9/20 | 22.777 | 21.94 |
| 12/10/20 | 22.932 | 21.95 |
| 12/11/20 | 23.064 | 21.902 |
| 12/14/20 | 22.781 | 21.805 |
| 12/15/20 | 22.937 | 22.127 |
| 12/16/20 | 22.991 | 22.241 |
| 12/17/20 | 22.934 | 21.959 |
| 12/18/20 | 23.118 | 22.173 |
| 12/21/20 | 22.563 | 21.822 |
| 12/22/20 | 22.392 | 21.715 |
| 12/23/20 | 22.886 | 21.849 |
| 12/24/20 | 22.806 | 21.802 |
| 12/28/20 | 22.924 | 21.952 |
| 12/29/20 | 22.663 | 21.735 |
| 12/30/20 | 22.749 | 21.623 |
| 12/31/20 | 22.358 | 20.784 |
| 1/4/21 | 21.788 | 20.338 |
| 1/5/21 | 21.799 | 20.395 |
| 1/6/21 | 22.118 | 20.708 |
| 1/7/21 | 22.158 | 20.973 |
| 1/8/21 | 22.26 | 20.983 |
| 1/11/21 | 22.118 | 20.884 |
| 1/12/21 | 22.413 | 21.179 |
| 1/13/21 | 22.458 | 20.959 |
| 1/14/21 | 22.603 | 21.191 |
| 1/15/21 | 22.792 | 21.425 |
| 1/19/21 | 23.202 | 21.778 |
| 1/20/21 | 23.319 | 21.99 |
| 1/21/21 | 23.249 | 21.883 |
| 1/22/21 | 23.832 | 22.154 |
| 1/25/21 | 23.97 | 22.333 |
| 1/26/21 | 23.774 | 22.304 |
| 1/27/21 | 23.687 | 22.596 |
| 1/28/21 | 23.09 | 21.89 |
| 1/29/21 | 22.558 | 20.665 |
| 2/1/21 | 22.345 | 20.409 |
| 2/2/21 | 22.507 | 20.348 |
| 2/3/21 | 22.007 | 20.134 |
| 2/4/21 | 22.815 | 20.411 |
| 2/5/21 | 22.707 | 20.241 |
| 2/8/21 | 22.99 | 20.339 |
| 2/9/21 | 23.341 | 20.678 |
| 2/10/21 | 23.258 | 20.533 |
| 2/11/21 | 23.349 | 20.748 |
| 2/12/21 | 22.928 | 20.344 |
| 2/16/21 | 22.379 | 20.061 |
| 2/17/21 | 22.435 | 20.19 |
| 2/18/21 | 22.339 | 19.863 |
| 2/19/21 | 22.069 | 19.694 |
| 2/22/21 | 22.077 | 19.601 |
| 2/23/21 | 19.889 | 19.402 |
| 2/24/21 | 19.223 | 19.35 |
| 2/25/21 | 18.957 | 19.011 |
| 2/26/21 | 18.812 | 18.716 |
| 3/1/21 | 19.661 | 19.329 |
| 3/2/21 | 19.151 | 18.852 |
| 3/3/21 | 19.2 | 18.735 |
| 3/4/21 | 18.946 | 18.56 |
| 3/5/21 | 19.295 | 18.776 |
| 3/8/21 | 19.568 | 18.934 |
| 3/9/21 | 19.836 | 19.121 |
| 3/10/21 | 20.093 | 19.297 |
| 3/11/21 | 20.127 | 19.736 |
| 3/12/21 | 20.191 | 19.917 |
| 3/15/21 | 20.265 | 20.42 |
| 3/16/21 | 20.131 | 20.158 |
| 3/17/21 | 20.693 | 20.322 |
| 3/18/21 | 20.633 | 20.494 |
| 3/19/21 | 20.195 | 20.325 |
| 3/22/21 | 20.306 | 20.403 |
| 3/23/21 | 20.044 | 20.287 |
| 3/24/21 | 20.18 | 20.16 |
| 3/25/21 | 20.474 | 20.317 |
| 3/26/21 | 20.461 | 18.936 |
| 3/29/21 | 20.882 | 19.41 |
| 3/30/21 | 20.561 | 19.405 |
| 3/31/21 | 20.478 | 18.532 |
| 4/1/21 | 18.61 | 18.597 |
| 4/5/21 | 19.279 | 19.112 |
| 4/6/21 | 19.241 | 18.874 |
| 4/7/21 | 19.011 | 18.838 |
| 4/8/21 | 19.36 | 18.917 |
| 4/9/21 | 19.422 | 18.903 |
| 4/12/21 | 19.403 | 19.077 |
| 4/13/21 | 19.208 | 18.968 |
| 4/14/21 | 19.316 | 19.091 |
| 4/15/21 | 19.511 | 19.319 |
| 4/16/21 | 19.528 | 19.539 |
| 4/19/21 | 19.582 | 19.615 |
| 4/20/21 | 19.59 | 19.441 |
| 4/21/21 | 19.567 | 19.331 |
| 4/22/21 | 19.544 | 19.33 |
| 4/23/21 | 19.422 | 19.231 |
| 4/26/21 | 19.268 | 19.148 |
| 4/27/21 | 19.347 | 19.226 |
| 4/28/21 | 19.133 | 19.093 |
| 4/29/21 | 19.453 | 19.38 |
| 4/30/21 | 19.542 | 18.49 |
| 5/3/21 | 20.009 | 18.762 |
| 5/4/21 | 20.221 | 18.982 |
| 5/5/21 | 20.01 | 18.704 |
| 5/6/21 | 20.047 | 18.672 |
| 5/7/21 | 20.072 | 18.843 |
| 5/10/21 | 20.159 | 18.768 |
| 5/11/21 | 20.198 | 18.444 |
| 5/12/21 | 19.578 | 18.139 |
| 5/13/21 | 19.96 | 18.47 |
| 5/14/21 | 19.947 | 18.529 |
| 5/17/21 | 19.947 | 18.562 |
| 5/18/21 | 19.875 | 18.498 |
| 5/19/21 | 19.698 | 18.232 |
| 5/20/21 | 19.823 | 18.336 |
| 5/21/21 | 19.823 | 18.542 |
| 5/24/21 | 19.864 | 18.824 |
| 5/25/21 | 19.75 | 18.649 |
| 5/26/21 | 19.794 | 18.7 |
| 5/27/21 | 19.856 | 18.671 |
| 5/28/21 | 19.825 | 18.694 |
| 6/1/21 | 19.912 | 18.775 |
| 6/2/21 | 20.009 | 18.964 |
| 6/3/21 | 19.978 | 18.89 |
| 6/4/21 | 20.119 | 19.108 |
| 6/7/21 | 20.149 | 19.046 |
| 6/8/21 | 20.242 | 19.078 |
| 6/9/21 | 20.246 | 19.18 |
| 6/10/21 | 20.584 | 19.442 |
| 6/11/21 | 20.624 | 19.486 |
| 6/14/21 | 20.587 | 19.371 |
| 6/15/21 | 20.676 | 19.474 |
| 6/16/21 | 20.431 | 19.394 |
| 6/17/21 | 20.433 | 19.355 |
| 6/18/21 | 19.958 | 19.071 |
| 6/21/21 | 20.416 | 19.334 |
| 6/22/21 | 20.344 | 19.333 |
| 6/23/21 | 19.978 | 19.057 |
| 6/24/21 | 19.887 | 18.926 |
| 6/25/21 | 19.914 | 19.162 |
| 6/28/21 | 19.702 | 18.777 |
| 6/29/21 | 19.474 | 18.572 |
| 6/30/21 | 19.507 | 18.015 |
| 7/1/21 | 19.879 | 18.171 |
| 7/2/21 | 19.756 | 18.164 |
| 7/6/21 | 19.53 | 18.159 |
| 7/7/21 | 20.031 | 18.459 |
| 7/8/21 | 19.981 | 18.376 |
| 7/9/21 | 20.195 | 18.52 |
| 7/12/21 | 20.243 | 18.528 |
| 7/13/21 | 20.174 | 18.469 |
| 7/14/21 | 20.137 | 18.476 |
| 7/15/21 | 20.313 | 18.552 |
| 7/16/21 | 20.472 | 18.654 |
| 7/19/21 | 19.889 | 18.251 |
| 7/20/21 | 20.216 | 18.558 |
| 7/21/21 | 20.351 | 18.56 |
| 7/22/21 | 20.266 | 18.493 |
| 7/23/21 | 20.499 | 18.679 |
| 7/26/21 | 20.507 | 18.651 |
| 7/27/21 | 20.565 | 18.641 |
| 7/28/21 | 20.521 | 18.678 |
| 7/29/21 | 20.605 | 18.689 |
| 7/30/21 | 20.499 | 17.626 |
| 8/2/21 | 20.632 | 17.635 |
| 8/3/21 | 18.375 | 16.95 |
| 8/4/21 | 18.2 | 16.736 |
| 8/5/21 | 18.155 | 16.719 |
| 8/6/21 | 18.18 | 16.719 |
| 8/9/21 | 18.051 | 16.611 |
| 8/10/21 | 18.217 | 16.678 |
| 8/11/21 | 18.564 | 16.778 |
| 8/12/21 | 18.471 | 16.741 |
| 8/13/21 | 18.423 | 16.669 |
| 8/16/21 | 18.856 | 16.861 |
| 8/17/21 | 19.039 | 17.03 |
| 8/18/21 | 18.614 | 16.7 |
| 8/19/21 | 18.621 | 16.817 |
| 8/20/21 | 18.552 | 16.964 |
| 8/23/21 | 18.56 | 16.854 |
| 8/24/21 | 18.635 | 16.823 |
| 8/25/21 | 18.802 | 16.857 |
| 8/26/21 | 18.856 | 16.866 |
| 8/27/21 | 18.918 | 16.944 |
| 8/30/21 | 18.889 | 16.908 |
| 8/31/21 | 18.899 | 16.929 |
| 9/1/21 | 18.831 | 16.953 |
| 9/2/21 | 19.101 | 17.174 |
| 9/3/21 | 19.074 | 17.189 |
| 9/7/21 | 18.82 | 16.882 |
| 9/8/21 | 19.053 | 17.12 |
| 9/9/21 | 19.082 | 17.062 |
| 9/10/21 | 18.731 | 16.864 |
| 9/13/21 | 18.924 | 17.112 |
| 9/14/21 | 18.224 | 16.684 |
| 9/15/21 | 18.134 | 16.823 |
| 9/16/21 | 17.722 | 16.676 |
| 9/17/21 | 17.685 | 16.681 |
| 9/20/21 | 17.766 | 16.618 |
| 9/21/21 | 17.51 | 16.37 |
| 9/22/21 | 17.762 | 16.473 |
| 9/23/21 | 17.92 | 16.55 |
| 9/24/21 | 18.252 | 16.742 |
| 9/27/21 | 18.61 | 16.874 |
| 9/28/21 | 18.6 | 16.795 |
| 9/29/21 | 18.868 | 16.996 |
| 9/30/21 | 18.517 | 16.691 |
| 10/1/21 | 18.768 | 16.893 |
| 10/4/21 | 18.85 | 17.016 |
| 10/5/21 | 18.573 | 16.795 |
| 10/6/21 | 18.673 | 16.888 |
| 10/7/21 | 18.777 | 17.093 |
| 10/8/21 | 19.047 | 17.192 |
| 10/11/21 | 18.818 | 17.114 |
| 10/12/21 | 18.928 | 17.178 |
| 10/13/21 | 18.92 | 17.263 |
| 10/14/21 | 19.163 | 17.371 |
| 10/15/21 | 19.319 | 17.467 |
| 10/18/21 | 19.203 | 17.381 |
| 10/19/21 | 19.203 | 17.427 |
| 10/20/21 | 19.322 | 17.502 |
| 10/21/21 | 19.538 | 17.736 |
| 10/22/21 | 19.656 | 17.796 |
| 10/25/21 | 19.619 | 17.822 |
| 10/26/21 | 19.455 | 17.599 |
| 10/27/21 | 19.064 | 16.878 |
| 10/28/21 | 18.978 | 17.136 |
| 10/29/21 | 19.259 | 18.049 |